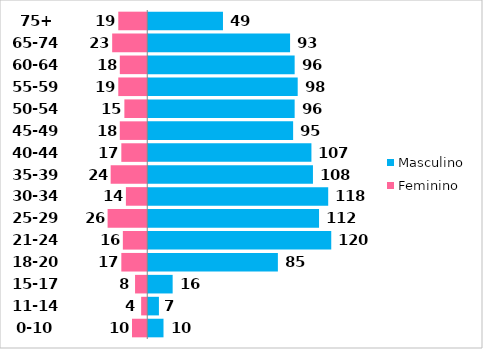
| Category | Feminino | Masculino |
|---|---|---|
| 0-10 | -10 | 10 |
| 11-14 | -4 | 7 |
| 15-17 | -8 | 16 |
| 18-20 | -17 | 85 |
| 21-24 | -16 | 120 |
| 25-29 | -26 | 112 |
| 30-34 | -14 | 118 |
| 35-39 | -24 | 108 |
| 40-44 | -17 | 107 |
| 45-49 | -18 | 95 |
| 50-54 | -15 | 96 |
| 55-59 | -19 | 98 |
| 60-64 | -18 | 96 |
| 65-74 | -23 | 93 |
| 75+ | -19 | 49 |